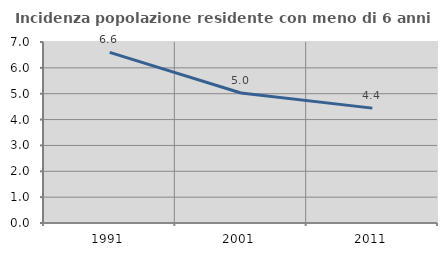
| Category | Incidenza popolazione residente con meno di 6 anni |
|---|---|
| 1991.0 | 6.601 |
| 2001.0 | 5.028 |
| 2011.0 | 4.443 |